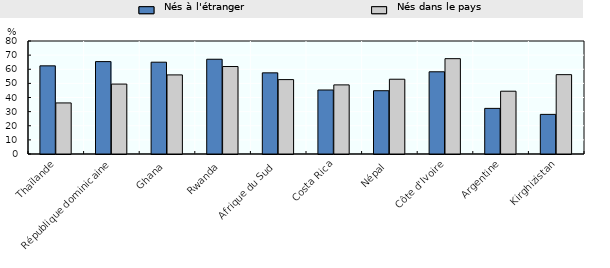
| Category | Nés à l'étranger | Nés dans le pays |
|---|---|---|
| Thaïlande | 62.41 | 36.16 |
| République dominicaine | 65.41 | 49.51 |
| Ghana | 65 | 56 |
| Rwanda | 67.08 | 61.93 |
| Afrique du Sud | 57.45 | 52.67 |
| Costa Rica | 45.32 | 48.93 |
| Népal | 44.81 | 52.94 |
| Côte d'Ivoire | 58.2 | 67.5 |
| Argentine | 32.29 | 44.45 |
| Kirghizistan | 28.05 | 56.18 |